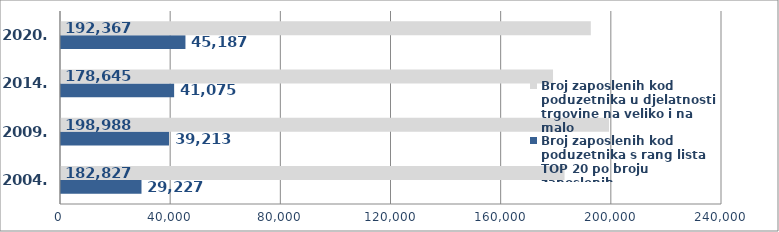
| Category | Broj zaposlenih kod poduzetnika s rang lista TOP 20 po broju zaposlenih  | Broj zaposlenih kod poduzetnika u djelatnosti trgovine na veliko i na malo |
|---|---|---|
| 2004. | 29227 | 182827 |
| 2009. | 39213 | 198988 |
| 2014. | 41075 | 178645 |
| 2020. | 45187 | 192367 |